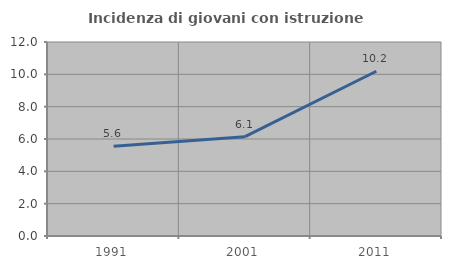
| Category | Incidenza di giovani con istruzione universitaria |
|---|---|
| 1991.0 | 5.556 |
| 2001.0 | 6.145 |
| 2011.0 | 10.191 |